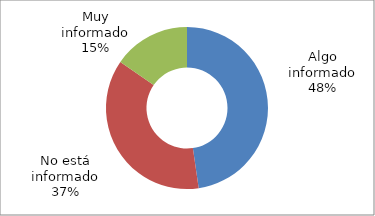
| Category | Series 0 |
|---|---|
| Algo informado | 0.477 |
| No está informado | 0.369 |
| Muy informado | 0.154 |